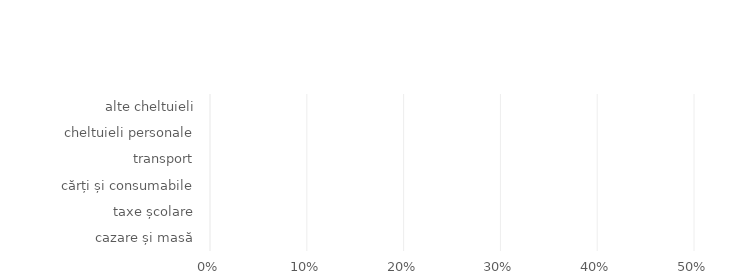
| Category | Series 0 |
|---|---|
| cazare și masă | 0 |
| taxe școlare | 0 |
| cărți și consumabile | 0 |
| transport | 0 |
| cheltuieli personale | 0 |
| alte cheltuieli | 0 |